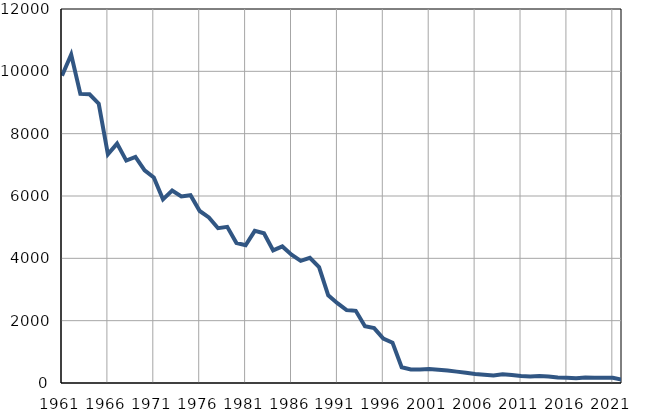
| Category | Умрла 
одојчад |
|---|---|
| 1961.0 | 9858 |
| 1962.0 | 10538 |
| 1963.0 | 9276 |
| 1964.0 | 9264 |
| 1965.0 | 8965 |
| 1966.0 | 7339 |
| 1967.0 | 7682 |
| 1968.0 | 7136 |
| 1969.0 | 7255 |
| 1970.0 | 6820 |
| 1971.0 | 6594 |
| 1972.0 | 5893 |
| 1973.0 | 6175 |
| 1974.0 | 5983 |
| 1975.0 | 6023 |
| 1976.0 | 5519 |
| 1977.0 | 5312 |
| 1978.0 | 4966 |
| 1979.0 | 5011 |
| 1980.0 | 4491 |
| 1981.0 | 4419 |
| 1982.0 | 4880 |
| 1983.0 | 4805 |
| 1984.0 | 4256 |
| 1985.0 | 4382 |
| 1986.0 | 4119 |
| 1987.0 | 3921 |
| 1988.0 | 4018 |
| 1989.0 | 3719 |
| 1990.0 | 2815 |
| 1991.0 | 2560 |
| 1992.0 | 2339 |
| 1993.0 | 2315 |
| 1994.0 | 1821 |
| 1995.0 | 1760 |
| 1996.0 | 1426 |
| 1997.0 | 1295 |
| 1998.0 | 507 |
| 1999.0 | 436 |
| 2000.0 | 434 |
| 2001.0 | 448 |
| 2002.0 | 423 |
| 2003.0 | 401 |
| 2004.0 | 365 |
| 2005.0 | 327 |
| 2006.0 | 292 |
| 2007.0 | 265 |
| 2008.0 | 242 |
| 2009.0 | 279 |
| 2010.0 | 258 |
| 2011.0 | 223 |
| 2012.0 | 208 |
| 2013.0 | 223 |
| 2014.0 | 209 |
| 2015.0 | 174 |
| 2016.0 | 166 |
| 2017.0 | 154 |
| 2018.0 | 174 |
| 2019.0 | 165 |
| 2020.0 | 171 |
| 2021.0 | 167 |
| 2022.0 | 107 |